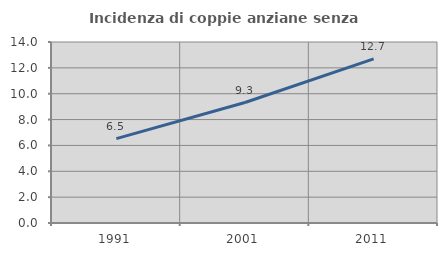
| Category | Incidenza di coppie anziane senza figli  |
|---|---|
| 1991.0 | 6.525 |
| 2001.0 | 9.32 |
| 2011.0 | 12.696 |